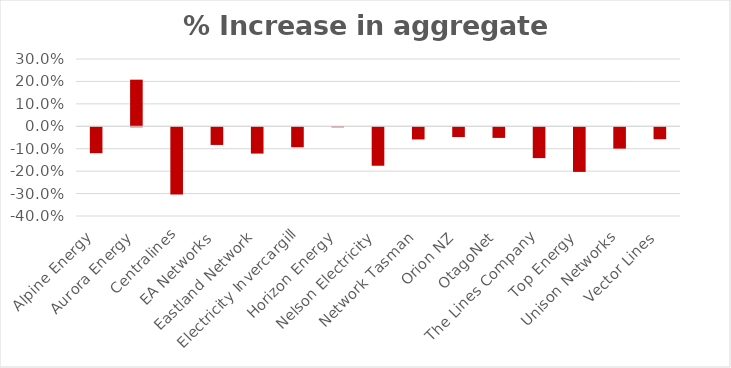
| Category | % Increase in aggregate prices |
|---|---|
| Alpine Energy | -0.116 |
| Aurora Energy | 0.208 |
| Centralines | -0.3 |
| EA Networks | -0.079 |
| Eastland Network | -0.117 |
| Electricity Invercargill | -0.089 |
| Horizon Energy | 0.001 |
| Nelson Electricity | -0.171 |
| Network Tasman | -0.054 |
| Orion NZ | -0.043 |
| OtagoNet | -0.047 |
| The Lines Company | -0.137 |
| Top Energy | -0.199 |
| Unison Networks | -0.095 |
| Vector Lines | -0.053 |